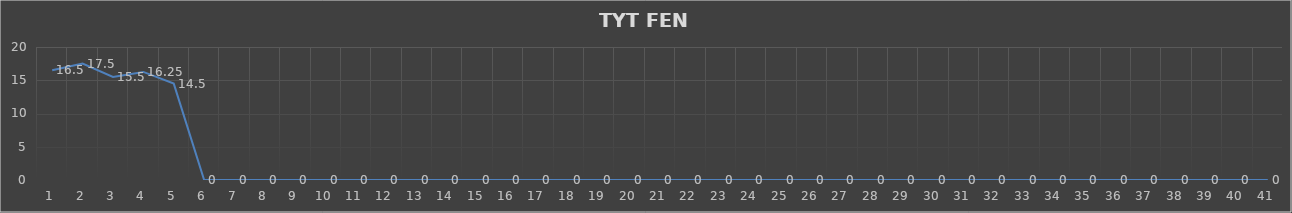
| Category | Series 0 |
|---|---|
| 0 | 16.5 |
| 1 | 17.5 |
| 2 | 15.5 |
| 3 | 16.25 |
| 4 | 14.5 |
| 5 | 0 |
| 6 | 0 |
| 7 | 0 |
| 8 | 0 |
| 9 | 0 |
| 10 | 0 |
| 11 | 0 |
| 12 | 0 |
| 13 | 0 |
| 14 | 0 |
| 15 | 0 |
| 16 | 0 |
| 17 | 0 |
| 18 | 0 |
| 19 | 0 |
| 20 | 0 |
| 21 | 0 |
| 22 | 0 |
| 23 | 0 |
| 24 | 0 |
| 25 | 0 |
| 26 | 0 |
| 27 | 0 |
| 28 | 0 |
| 29 | 0 |
| 30 | 0 |
| 31 | 0 |
| 32 | 0 |
| 33 | 0 |
| 34 | 0 |
| 35 | 0 |
| 36 | 0 |
| 37 | 0 |
| 38 | 0 |
| 39 | 0 |
| 40 | 0 |